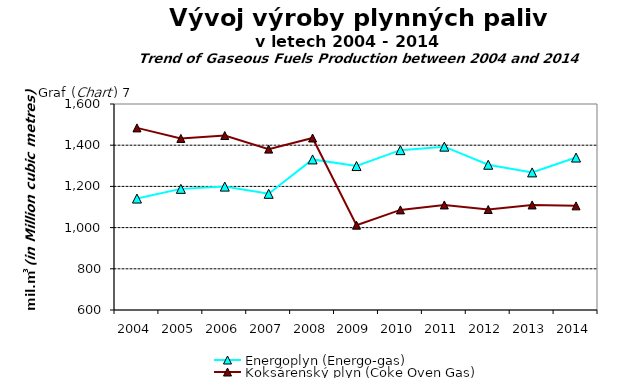
| Category | Energoplyn (Energo-gas) | Koksárenský plyn (Coke Oven Gas) |
|---|---|---|
| 2004.0 | 1141 | 1484 |
| 2005.0 | 1188 | 1433 |
| 2006.0 | 1199 | 1447 |
| 2007.0 | 1164 | 1381 |
| 2008.0 | 1331 | 1435 |
| 2009.0 | 1298.811 | 1011.813 |
| 2010.0 | 1376 | 1086 |
| 2011.0 | 1393 | 1110 |
| 2012.0 | 1305.17 | 1087.826 |
| 2013.0 | 1268 | 1110 |
| 2014.0 | 1340.032 | 1105.483 |